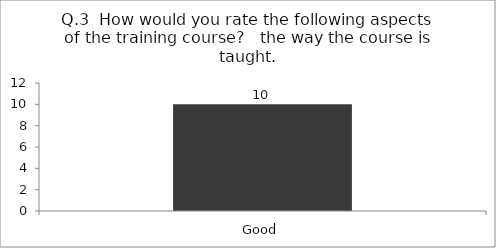
| Category | Q.3  How would you rate the following aspects of the training course?  |
|---|---|
| Good | 10 |